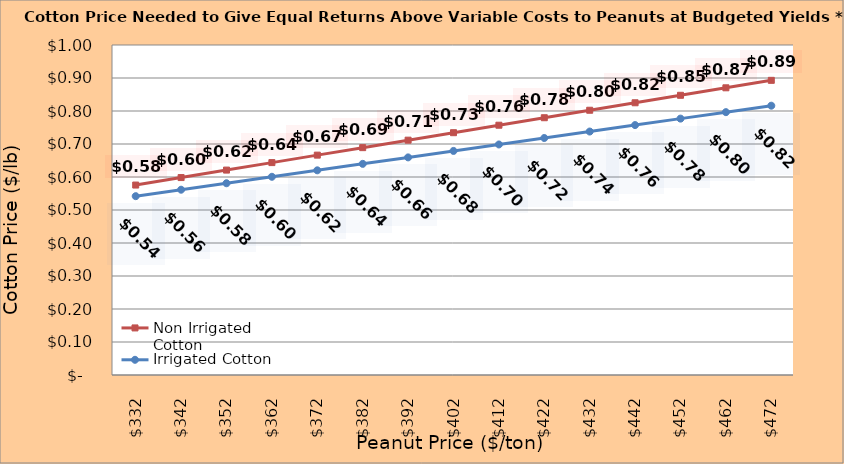
| Category | Non Irrigated Cotton | Irrigated Cotton |
|---|---|---|
| 332.02127659574467 | 0.576 | 0.542 |
| 342.02127659574467 | 0.598 | 0.561 |
| 352.02127659574467 | 0.621 | 0.581 |
| 362.02127659574467 | 0.644 | 0.601 |
| 372.02127659574467 | 0.666 | 0.62 |
| 382.02127659574467 | 0.689 | 0.64 |
| 392.02127659574467 | 0.712 | 0.659 |
| 402.02127659574467 | 0.734 | 0.679 |
| 412.02127659574467 | 0.757 | 0.699 |
| 422.02127659574467 | 0.78 | 0.718 |
| 432.02127659574467 | 0.802 | 0.738 |
| 442.02127659574467 | 0.825 | 0.757 |
| 452.02127659574467 | 0.848 | 0.777 |
| 462.02127659574467 | 0.87 | 0.796 |
| 472.02127659574467 | 0.893 | 0.816 |